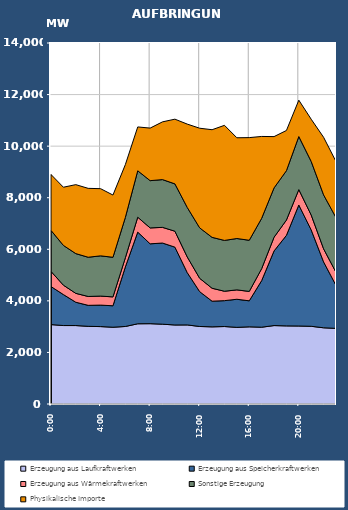
| Category | Erzeugung aus Laufkraftwerken | Erzeugung aus Speicherkraftwerken | Erzeugung aus Wärmekraftwerken | Sonstige Erzeugung | Physikalische Importe |
|---|---|---|---|---|---|
| 2007-01-17 | 3079.685 | 1475.6 | 588.573 | 1589.684 | 2166.444 |
| 2007-01-17 01:00:00 | 3043.076 | 1201.585 | 363.66 | 1542.55 | 2256.076 |
| 2007-01-17 02:00:00 | 3042.305 | 904.323 | 344.467 | 1541.625 | 2674.408 |
| 2007-01-17 03:00:00 | 3012.37 | 814.21 | 343.47 | 1521.469 | 2671.32 |
| 2007-01-17 04:00:00 | 3002.068 | 833.312 | 349.815 | 1560.397 | 2605.384 |
| 2007-01-17 05:00:00 | 2977.071 | 831.994 | 344.905 | 1535.58 | 2414.072 |
| 2007-01-17 06:00:00 | 3006.624 | 2307.61 | 356.923 | 1564.069 | 2048.568 |
| 2007-01-17 07:00:00 | 3111.419 | 3554.383 | 578.229 | 1800.765 | 1700.488 |
| 2007-01-17 08:00:00 | 3114.788 | 3096.869 | 617.081 | 1833.389 | 2037.404 |
| 2007-01-17 09:00:00 | 3094.674 | 3147.686 | 607.731 | 1852.283 | 2239.755 |
| 2007-01-17 10:00:00 | 3064.72 | 3019.046 | 618.034 | 1835.311 | 2509.035 |
| 2007-01-17 11:00:00 | 3066.21 | 2025.123 | 608.951 | 1919.037 | 3234.927 |
| 2007-01-17 12:00:00 | 3006.236 | 1350.377 | 518.269 | 1955.265 | 3864.61 |
| 2007-01-17 13:00:00 | 2991.976 | 994.831 | 502.045 | 1973.999 | 4174.642 |
| 2007-01-17 14:00:00 | 3004.711 | 1003.56 | 364.797 | 1970.127 | 4463.751 |
| 2007-01-17 15:00:00 | 2972.567 | 1089.529 | 363.863 | 1991.861 | 3906.612 |
| 2007-01-17 16:00:00 | 2992.468 | 1008.803 | 364.355 | 1983.737 | 3981.346 |
| 2007-01-17 17:00:00 | 2978.073 | 1807.091 | 462.878 | 1952.126 | 3176.01 |
| 2007-01-17 18:00:00 | 3041.327 | 2894.008 | 530.907 | 1913.29 | 1990.697 |
| 2007-01-17 19:00:00 | 3028.9 | 3510.592 | 594.14 | 1914.235 | 1559.484 |
| 2007-01-17 20:00:00 | 3024.412 | 4693.045 | 597.837 | 2057.037 | 1410.824 |
| 2007-01-17 21:00:00 | 3013.42 | 3736.784 | 578.735 | 2076.753 | 1637.264 |
| 2007-01-17 22:00:00 | 2955.731 | 2553.813 | 508.369 | 2091.433 | 2234.084 |
| 2007-01-17 23:00:00 | 2933.17 | 1667.556 | 505.904 | 2122.678 | 2174.484 |